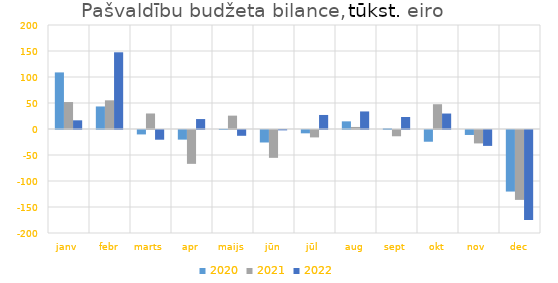
| Category | 2020 | 2021 | 2022 |
|---|---|---|---|
| janv | 108823.125 | 51841.777 | 16703.923 |
| febr | 43336.074 | 55170.117 | 147501.748 |
| marts | -8510.199 | 29854.421 | -18692.108 |
| apr | -18528 | -65110.731 | 19123.02 |
| maijs | 267.19 | 25695.562 | -11153.489 |
| jūn | -24020.19 | -53546.319 | -682.628 |
| jūl | -6388.533 | -14251.375 | 26988.29 |
| aug | 14711.699 | 3925.548 | 33769.918 |
| sept | 1399.66 | -12077.429 | 23100.994 |
| okt | -22549.866 | 47662.114 | 29746.087 |
| nov | -9553.519 | -25816.685 | -30579.652 |
| dec | -118383.812 | -134394.788 | -172941.944 |